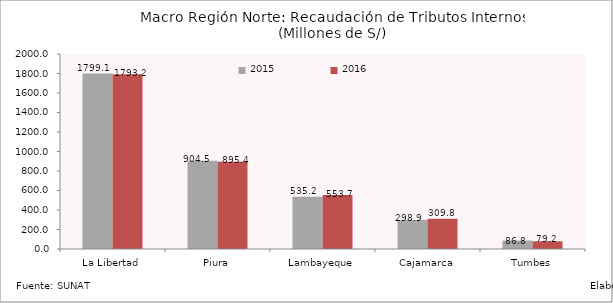
| Category | 2015 | 2016 |
|---|---|---|
| La Libertad | 1799.078 | 1793.211 |
| Piura | 904.544 | 895.36 |
| Lambayeque | 535.172 | 553.727 |
| Cajamarca | 298.888 | 309.765 |
| Tumbes | 86.769 | 79.183 |